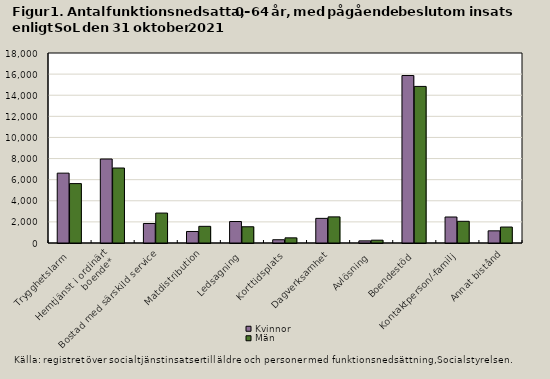
| Category | Kvinnor | Män |
|---|---|---|
| Trygghetslarm | 6617 | 5627 |
| Hemtjänst i ordinärt
boende* | 7957 | 7104 |
| Bostad med särskild service | 1849 | 2836 |
| Matdistribution | 1092 | 1578 |
| Ledsagning | 2035 | 1539 |
| Korttidsplats | 308 | 488 |
| Dagverksamhet | 2334 | 2475 |
| Avlösning | 202 | 267 |
| Boendestöd | 15866 | 14834 |
| Kontaktperson/-familj | 2462 | 2055 |
| Annat bistånd | 1152 | 1512 |